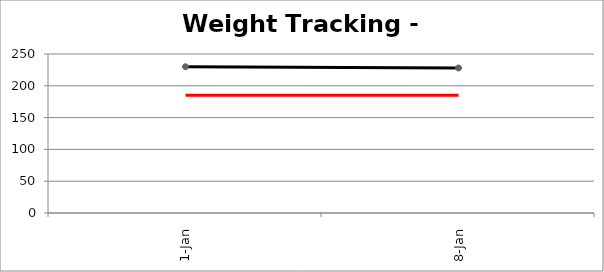
| Category | Sum of Wt | Sum of Tgt Wt |
|---|---|---|
| 1-Jan | 230 | 185 |
| 8-Jan | 228 | 185 |